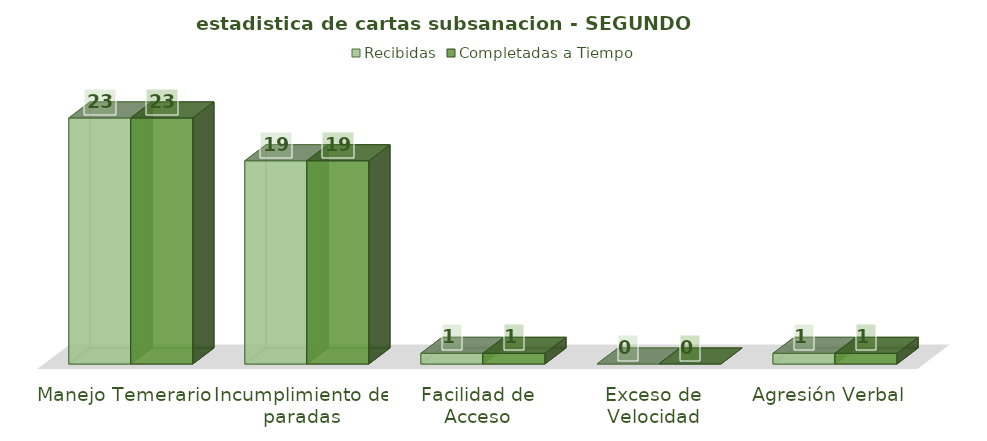
| Category | Recibidas | Completadas a Tiempo |
|---|---|---|
| Manejo Temerario | 23 | 23 |
| Incumplimiento de paradas | 19 | 19 |
| Facilidad de Acceso | 1 | 1 |
| Exceso de Velocidad | 0 | 0 |
| Agresión Verbal | 1 | 1 |